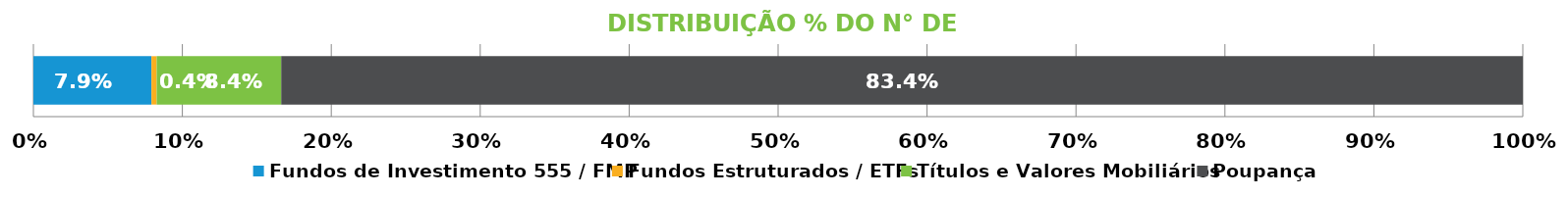
| Category | Fundos de Investimento 555 / FMP | Fundos Estruturados / ETFs | Títulos e Valores Mobiliários | Poupança |
|---|---|---|---|---|
| 0 | 0.079 | 0.004 | 0.084 | 0.834 |